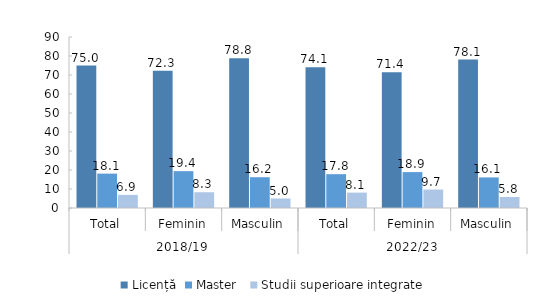
| Category | Licență | Master  | Studii superioare integrate |
|---|---|---|---|
| 0 | 75 | 18.1 | 6.9 |
| 1 | 72.3 | 19.4 | 8.3 |
| 2 | 78.8 | 16.2 | 5 |
| 3 | 74.1 | 17.8 | 8.1 |
| 4 | 71.4 | 18.9 | 9.7 |
| 5 | 78.1 | 16.1 | 5.8 |